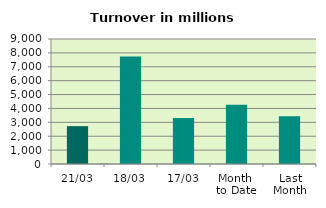
| Category | Series 0 |
|---|---|
| 21/03 | 2725.054 |
| 18/03 | 7736.644 |
| 17/03 | 3307.446 |
| Month 
to Date | 4273.886 |
| Last
Month | 3445.759 |